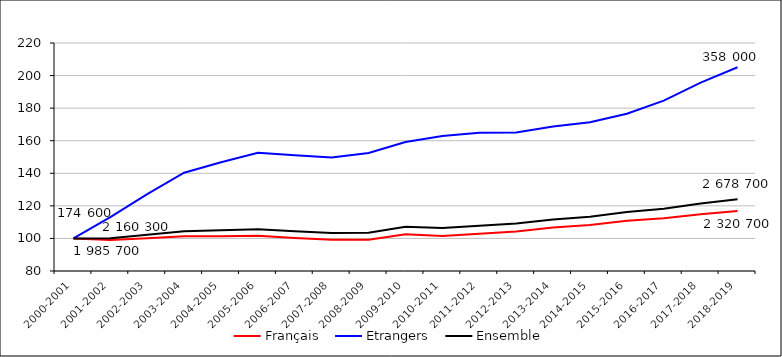
| Category | Français  | Etrangers  | Ensemble |
|---|---|---|---|
| 2000-2001 | 100 | 100 | 100 |
| 2001-2002 | 99.042 | 113.022 | 100.169 |
| 2002-2003 | 100.039 | 127.224 | 102.23 |
| 2003-2004 | 101.291 | 140.358 | 104.439 |
| 2004-2005 | 101.412 | 146.82 | 105.071 |
| 2005-2006 | 101.58 | 152.637 | 105.694 |
| 2006-2007 | 100.23 | 151.138 | 104.332 |
| 2007-2008 | 99.236 | 149.656 | 103.299 |
| 2008-2009 | 99.124 | 152.451 | 103.421 |
| 2009-2010 | 102.539 | 159.257 | 107.122 |
| 2010-2011 | 101.475 | 162.838 | 106.434 |
| 2011-2012 | 102.838 | 164.912 | 107.854 |
| 2012-2013 | 104.328 | 165.056 | 109.235 |
| 2013-2014 | 106.637 | 168.698 | 111.652 |
| 2014-2015 | 108.282 | 171.312 | 113.375 |
| 2015-2016 | 110.869 | 176.606 | 116.181 |
| 2016-2017 | 112.429 | 184.635 | 118.264 |
| 2017-2018 | 114.867 | 195.638 | 121.394 |
| 2018-2019 | 116.869 | 205.093 | 123.998 |